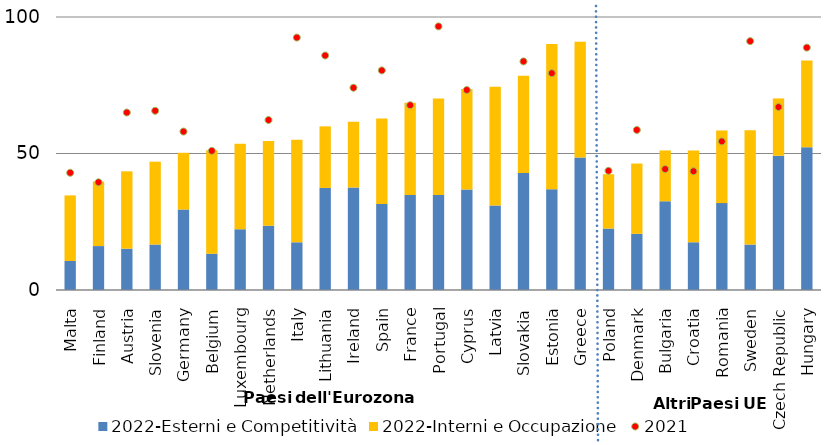
| Category | 2022-Esterni e Competitività | 2022-Interni e Occupazione |
|---|---|---|
| Malta | 10.635 | 24.016 |
| Finland | 16.077 | 23.693 |
| Austria | 15.135 | 28.336 |
| Slovenia | 16.655 | 30.352 |
| Germany | 29.464 | 20.796 |
| Belgium | 13.302 | 37.85 |
| Luxembourg | 22.262 | 31.326 |
| Netherlands | 23.563 | 31.03 |
| Italy | 17.472 | 37.586 |
| Lithuania | 37.413 | 22.532 |
| Ireland | 37.551 | 24.087 |
| Spain | 31.512 | 31.31 |
| France | 34.774 | 33.836 |
| Portugal | 34.827 | 35.296 |
| Cyprus | 36.776 | 36.866 |
| Latvia | 30.948 | 43.506 |
| Slovakia | 42.838 | 35.652 |
| Estonia | 36.916 | 53.153 |
| Greece | 48.492 | 42.403 |
| Poland | 22.515 | 19.905 |
| Denmark | 20.571 | 25.757 |
| Bulgaria | 32.506 | 18.616 |
| Croatia | 17.485 | 33.647 |
| Romania | 31.825 | 26.607 |
| Sweden | 16.643 | 41.917 |
| Czech Republic | 49.171 | 21.006 |
| Hungary | 52.332 | 31.732 |